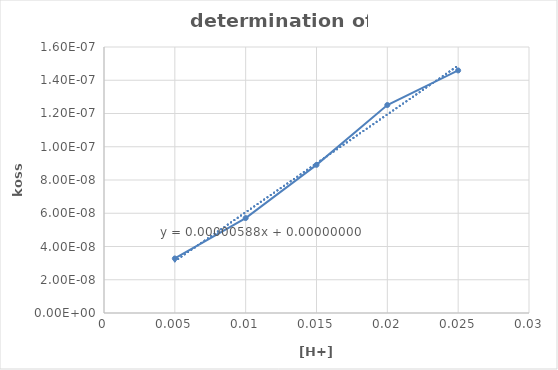
| Category | Series 0 |
|---|---|
| 0.005 | 0 |
| 0.01 | 0 |
| 0.015 | 0 |
| 0.02 | 0 |
| 0.025 | 0 |